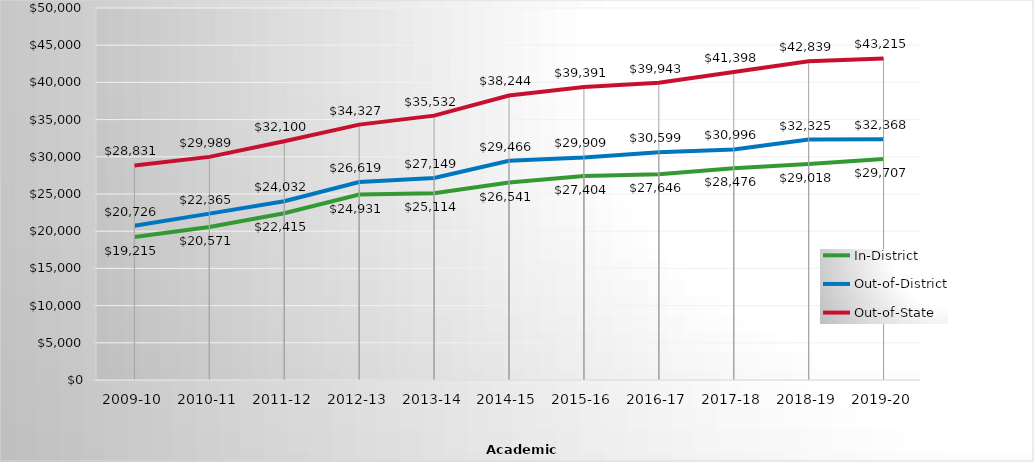
| Category | In-District | Out-of-District | Out-of-State |
|---|---|---|---|
| 2009-10 | 19215 | 20726 | 28831 |
| 2010-11 | 20571 | 22365 | 29989 |
| 2011-12 | 22415 | 24032 | 32100 |
| 2012-13 | 24931 | 26619 | 34327 |
| 2013-14 | 25114.27 | 27148.6 | 35532.25 |
| 2014-15 | 26541.34 | 29465.87 | 38243.8 |
| 2015-16 | 27404 | 29909 | 39391 |
| 2016-17 | 27646 | 30599 | 39943 |
| 2017-18 | 28476 | 30996 | 41398 |
| 2018-19 | 29018 | 32325 | 42839 |
| 2019-20 | 29707 | 32368 | 43215 |